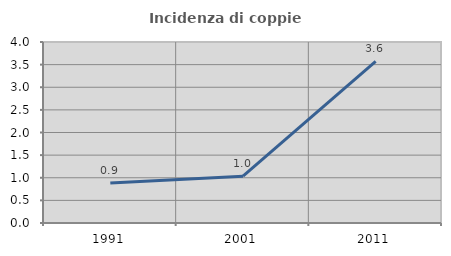
| Category | Incidenza di coppie miste |
|---|---|
| 1991.0 | 0.885 |
| 2001.0 | 1.034 |
| 2011.0 | 3.571 |